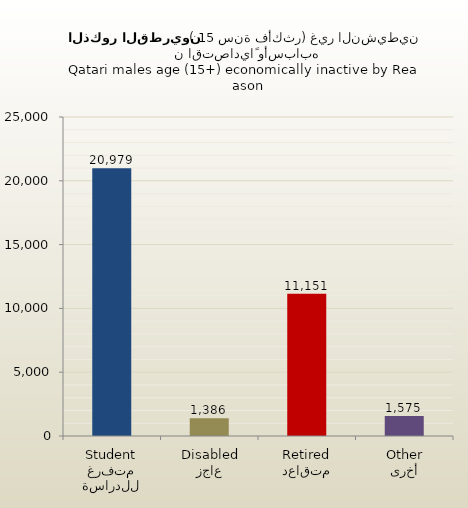
| Category | الذكور القطريين |
|---|---|
| متفرغ للدراسة
Student | 20979 |
| عاجز
Disabled | 1386 |
| متقاعد
Retired | 11151 |
| أخرى
Other | 1575 |